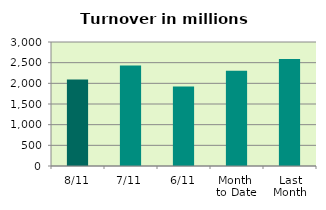
| Category | Series 0 |
|---|---|
| 8/11 | 2094.653 |
| 7/11 | 2430.876 |
| 6/11 | 1924.648 |
| Month 
to Date | 2304.084 |
| Last
Month | 2586.958 |